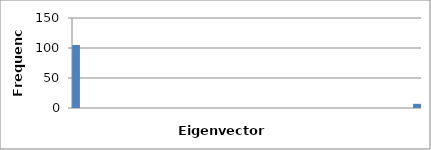
| Category | 105 |
|---|---|
| 0.0 | 105 |
| 0.0033222558139534885 | 0 |
| 0.006644511627906977 | 0 |
| 0.009966767441860466 | 0 |
| 0.013289023255813954 | 0 |
| 0.01661127906976744 | 0 |
| 0.01993353488372093 | 0 |
| 0.023255790697674417 | 0 |
| 0.026578046511627904 | 0 |
| 0.029900302325581392 | 0 |
| 0.03322255813953488 | 0 |
| 0.036544813953488374 | 0 |
| 0.039867069767441865 | 0 |
| 0.043189325581395356 | 0 |
| 0.04651158139534885 | 0 |
| 0.04983383720930234 | 0 |
| 0.05315609302325583 | 0 |
| 0.05647834883720932 | 0 |
| 0.05980060465116281 | 0 |
| 0.0631228604651163 | 0 |
| 0.06644511627906978 | 0 |
| 0.06976737209302326 | 0 |
| 0.07308962790697675 | 0 |
| 0.07641188372093023 | 0 |
| 0.07973413953488372 | 0 |
| 0.0830563953488372 | 0 |
| 0.08637865116279068 | 0 |
| 0.08970090697674417 | 0 |
| 0.09302316279069765 | 0 |
| 0.09634541860465114 | 0 |
| 0.09966767441860462 | 0 |
| 0.1029899302325581 | 0 |
| 0.10631218604651159 | 0 |
| 0.10963444186046507 | 0 |
| 0.11295669767441856 | 0 |
| 0.11627895348837204 | 0 |
| 0.11960120930232553 | 0 |
| 0.12292346511627901 | 0 |
| 0.1262457209302325 | 0 |
| 0.129567976744186 | 0 |
| 0.13289023255813948 | 0 |
| 0.13621248837209296 | 0 |
| 0.13953474418604644 | 0 |
| 0.142857 | 7 |